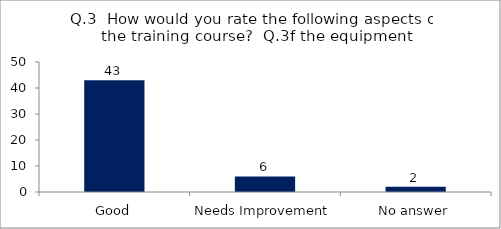
| Category | Q.3  How would you rate the following aspects of the training course?  |
|---|---|
| Good | 43 |
| Needs Improvement | 6 |
| No answer | 2 |